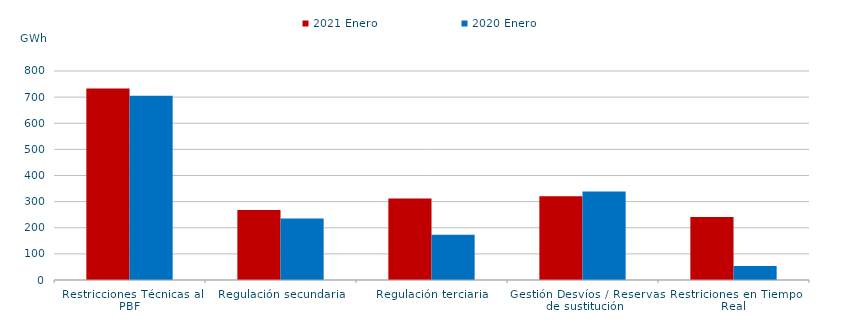
| Category | 2021 Enero | 2020 Enero |
|---|---|---|
| Restricciones Técnicas al PBF | 733.448 | 704.949 |
| Regulación secundaria | 267.897 | 235.2 |
| Regulación terciaria | 311.777 | 173.395 |
| Gestión Desvíos / Reservas de sustitución | 320.856 | 338.308 |
| Restriciones en Tiempo Real | 240.894 | 53.615 |